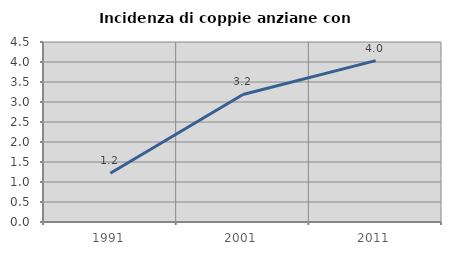
| Category | Incidenza di coppie anziane con figli |
|---|---|
| 1991.0 | 1.22 |
| 2001.0 | 3.188 |
| 2011.0 | 4.035 |